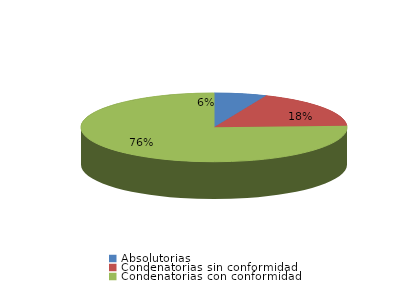
| Category | Series 0 |
|---|---|
| Absolutorias | 15 |
| Condenatorias sin conformidad | 42 |
| Condenatorias con conformidad | 178 |